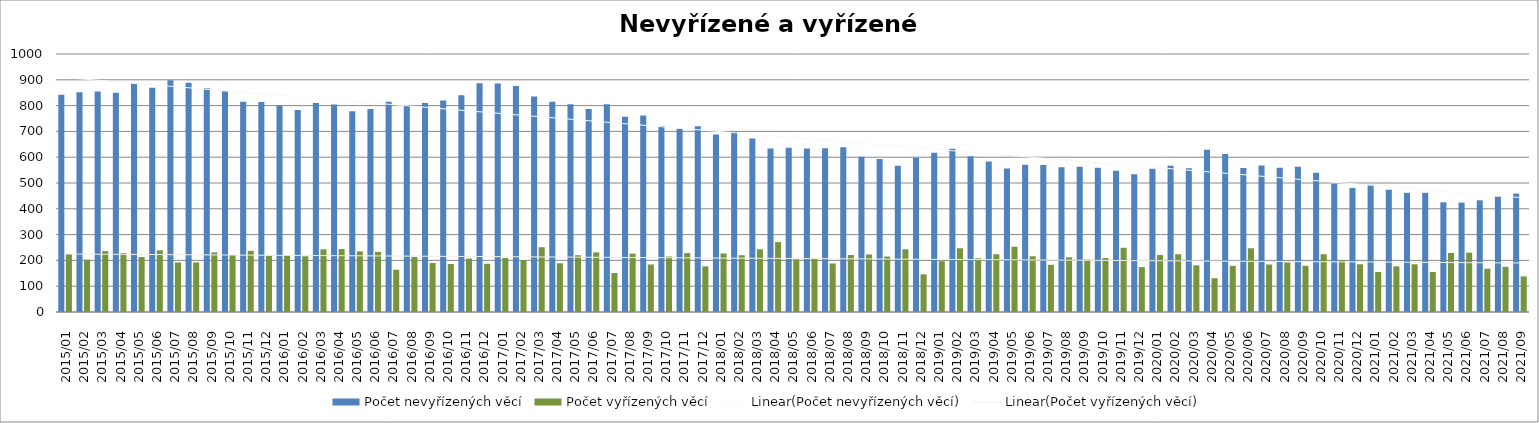
| Category | Počet nevyřízených věcí | Počet vyřízených věcí |
|---|---|---|
| 2015/01 | 842 | 225 |
| 2015/02 | 852 | 203 |
| 2015/03 | 855 | 236 |
| 2015/04 | 850 | 228 |
| 2015/05 | 886 | 213 |
| 2015/06 | 869 | 239 |
| 2015/07 | 898 | 192 |
| 2015/08 | 889 | 192 |
| 2015/09 | 867 | 231 |
| 2015/10 | 856 | 221 |
| 2015/11 | 815 | 237 |
| 2015/12 | 814 | 219 |
| 2016/01 | 799 | 220 |
| 2016/02 | 783 | 216 |
| 2016/03 | 810 | 243 |
| 2016/04 | 804 | 244 |
| 2016/05 | 778 | 235 |
| 2016/06 | 787 | 233 |
| 2016/07 | 815 | 164 |
| 2016/08 | 800 | 213 |
| 2016/09 | 810 | 190 |
| 2016/10 | 820 | 186 |
| 2016/11 | 840 | 207 |
| 2016/12 | 887 | 187 |
| 2017/01 | 886 | 209 |
| 2017/02 | 876 | 201 |
| 2017/03 | 835 | 251 |
| 2017/04 | 815 | 189 |
| 2017/05 | 805 | 220 |
| 2017/06 | 787 | 231 |
| 2017/07 | 805 | 151 |
| 2017/08 | 757 | 226 |
| 2017/09 | 762 | 184 |
| 2017/10 | 721 | 215 |
| 2017/11 | 710 | 228 |
| 2017/12 | 720 | 177 |
| 2018/01 | 688 | 227 |
| 2018/02 | 699 | 220 |
| 2018/03 | 672 | 243 |
| 2018/04 | 634 | 271 |
| 2018/05 | 637 | 204 |
| 2018/06 | 634 | 207 |
| 2018/07 | 635 | 188 |
| 2018/08 | 639 | 221 |
| 2018/09 | 602 | 223 |
| 2018/10 | 593 | 215 |
| 2018/11 | 567 | 243 |
| 2018/12 | 598 | 146 |
| 2019/01 | 617 | 197 |
| 2019/02 | 633 | 247 |
| 2019/03 | 604 | 208 |
| 2019/04 | 583 | 224 |
| 2019/05 | 556 | 253 |
| 2019/06 | 571 | 216 |
| 2019/07 | 570 | 183 |
| 2019/08 | 561 | 212 |
| 2019/09 | 563 | 203 |
| 2019/10 | 559 | 209 |
| 2019/11 | 547 | 249 |
| 2019/12 | 534 | 174 |
| 2020/01 | 555 | 221 |
| 2020/02 | 567 | 224 |
| 2020/03 | 557 | 181 |
| 2020/04 | 629 | 131 |
| 2020/05 | 612 | 179 |
| 2020/06 | 558 | 247 |
| 2020/07 | 568 | 184 |
| 2020/08 | 559 | 192 |
| 2020/09 | 563 | 179 |
| 2020/10 | 540 | 224 |
| 2020/11 | 497 | 201 |
| 2020/12 | 481 | 185 |
| 2021/01 | 493 | 155 |
| 2021/02 | 474 | 177 |
| 2021/03 | 462 | 185 |
| 2021/04 | 462 | 155 |
| 2021/05 | 425 | 229 |
| 2021/06 | 424 | 230 |
| 2021/07 | 433 | 168 |
| 2021/08 | 447 | 175 |
| 2021/09 | 459 | 138 |